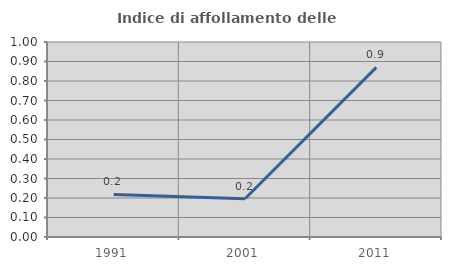
| Category | Indice di affollamento delle abitazioni  |
|---|---|
| 1991.0 | 0.218 |
| 2001.0 | 0.196 |
| 2011.0 | 0.87 |